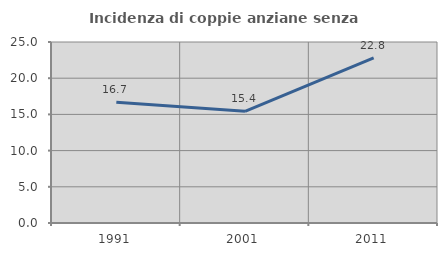
| Category | Incidenza di coppie anziane senza figli  |
|---|---|
| 1991.0 | 16.667 |
| 2001.0 | 15.423 |
| 2011.0 | 22.807 |